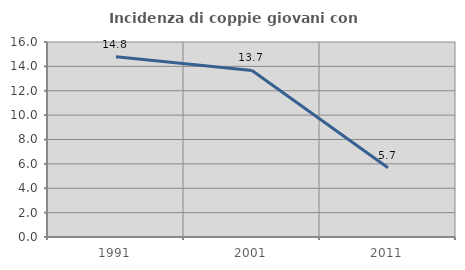
| Category | Incidenza di coppie giovani con figli |
|---|---|
| 1991.0 | 14.798 |
| 2001.0 | 13.669 |
| 2011.0 | 5.689 |